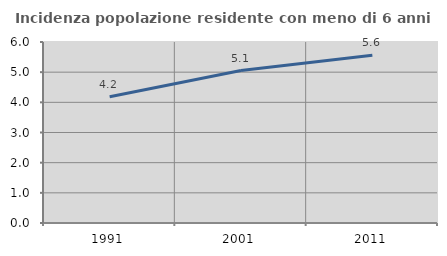
| Category | Incidenza popolazione residente con meno di 6 anni |
|---|---|
| 1991.0 | 4.184 |
| 2001.0 | 5.053 |
| 2011.0 | 5.563 |